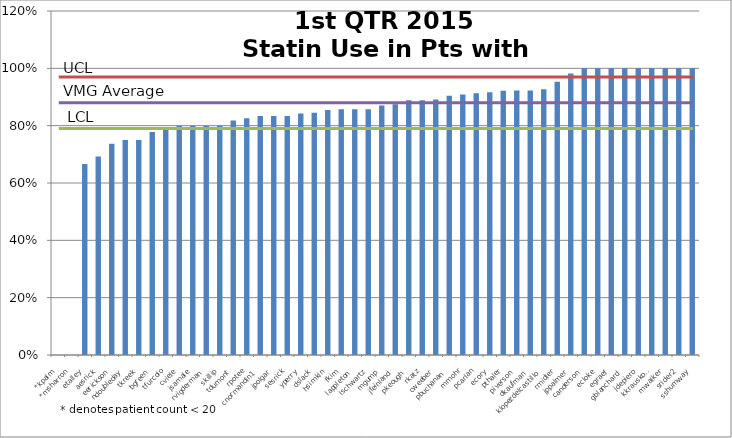
| Category | Series 0 |
|---|---|
| *kpalm | 0 |
| *msharron | 0 |
| etalley | 0.667 |
| aesrick | 0.692 |
| eerickson | 0.737 |
| ndoubleday | 0.75 |
| tkreek | 0.75 |
| bgreen | 0.778 |
| tfurcolo | 0.795 |
| cviele | 0.8 |
| jsamale | 0.8 |
| rvigderman | 0.8 |
| skillip | 0.8 |
| tdumont | 0.818 |
| rpotee | 0.826 |
| cnormandin1 | 0.833 |
| jpolgar | 0.833 |
| sesrick | 0.833 |
| yperry | 0.842 |
| dslack | 0.845 |
| hsimkin | 0.855 |
| fkim | 0.857 |
| lappleton | 0.857 |
| lschwartz | 0.857 |
| mgump | 0.87 |
| jfeinland | 0.875 |
| pkeough | 0.889 |
| rkatz | 0.889 |
| cweeber | 0.891 |
| pbuchanan | 0.905 |
| mmohr | 0.909 |
| pcarlan | 0.913 |
| ecory | 0.917 |
| pthaler | 0.922 |
| piverson | 0.922 |
| dkaufman | 0.923 |
| klopezdelcastillo | 0.927 |
| rmidler | 0.953 |
| jppalmer | 0.982 |
| canderson | 1 |
| ecloke | 1 |
| egraef | 1 |
| gblanchard | 1 |
| jdepiero | 1 |
| kkrauskopf | 1 |
| mwalker | 1 |
| srider2 | 1 |
| sshumway | 1 |